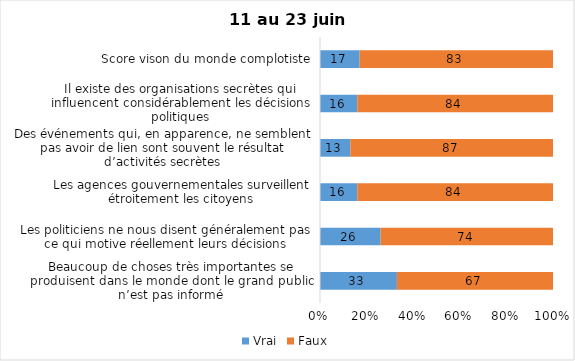
| Category | Vrai | Faux |
|---|---|---|
| Beaucoup de choses très importantes se produisent dans le monde dont le grand public n’est pas informé | 33 | 67 |
| Les politiciens ne nous disent généralement pas ce qui motive réellement leurs décisions | 26 | 74 |
| Les agences gouvernementales surveillent étroitement les citoyens | 16 | 84 |
| Des événements qui, en apparence, ne semblent pas avoir de lien sont souvent le résultat d’activités secrètes | 13 | 87 |
| Il existe des organisations secrètes qui influencent considérablement les décisions politiques | 16 | 84 |
| Score vison du monde complotiste | 17 | 83 |